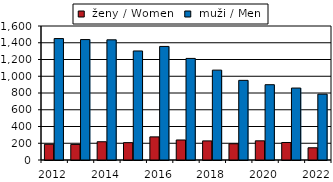
| Category |  ženy / Women  |  muži / Men |
|---|---|---|
| 2012.0 | 188 | 1450 |
| 2013.0 | 186 | 1438 |
| 2014.0 | 218 | 1435 |
| 2015.0 | 207 | 1302 |
| 2016.0 | 276 | 1356 |
| 2017.0 | 239 | 1213 |
| 2018.0 | 228 | 1073 |
| 2019.0 | 194 | 951 |
| 2020.0 | 229 | 899 |
| 2021.0 | 209 | 859 |
| 2022.0 | 146 | 786 |